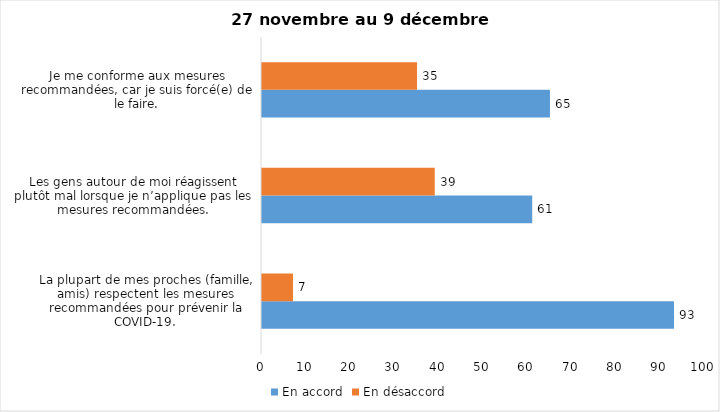
| Category | En accord | En désaccord |
|---|---|---|
| La plupart de mes proches (famille, amis) respectent les mesures recommandées pour prévenir la COVID-19. | 93 | 7 |
| Les gens autour de moi réagissent plutôt mal lorsque je n’applique pas les mesures recommandées. | 61 | 39 |
| Je me conforme aux mesures recommandées, car je suis forcé(e) de le faire. | 65 | 35 |